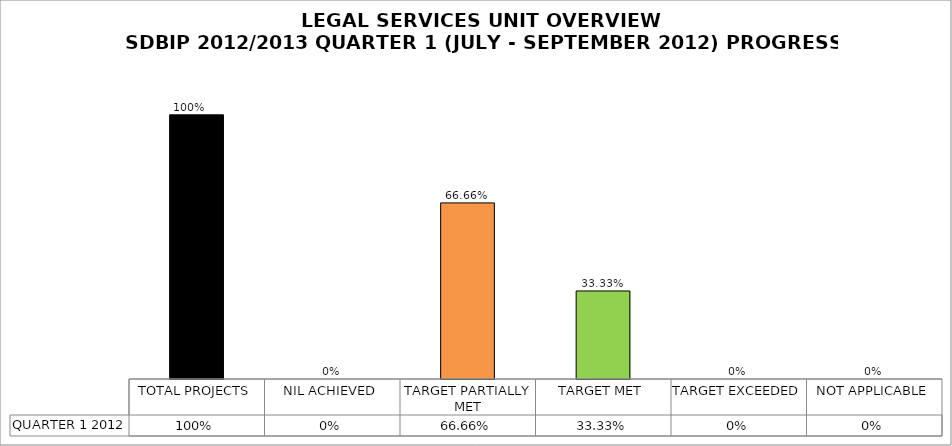
| Category | QUARTER 1 2012 |
|---|---|
| TOTAL PROJECTS | 1 |
| NIL ACHIEVED | 0 |
| TARGET PARTIALLY MET | 0.667 |
| TARGET MET | 0.333 |
| TARGET EXCEEDED | 0 |
| NOT APPLICABLE | 0 |